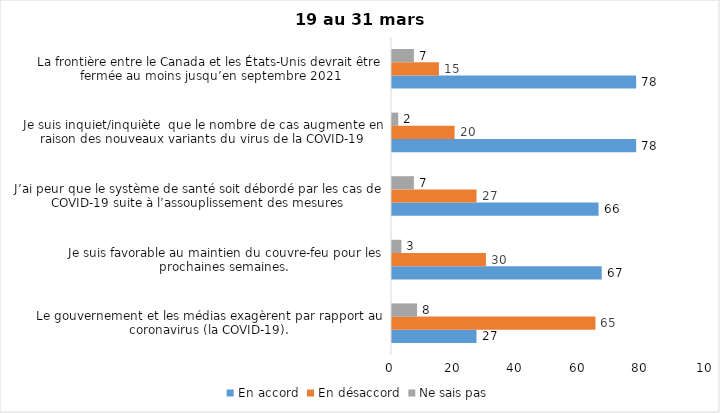
| Category | En accord | En désaccord | Ne sais pas |
|---|---|---|---|
| Le gouvernement et les médias exagèrent par rapport au coronavirus (la COVID-19). | 27 | 65 | 8 |
| Je suis favorable au maintien du couvre-feu pour les prochaines semaines. | 67 | 30 | 3 |
| J’ai peur que le système de santé soit débordé par les cas de COVID-19 suite à l’assouplissement des mesures | 66 | 27 | 7 |
| Je suis inquiet/inquiète  que le nombre de cas augmente en raison des nouveaux variants du virus de la COVID-19 | 78 | 20 | 2 |
| La frontière entre le Canada et les États-Unis devrait être fermée au moins jusqu’en septembre 2021 | 78 | 15 | 7 |